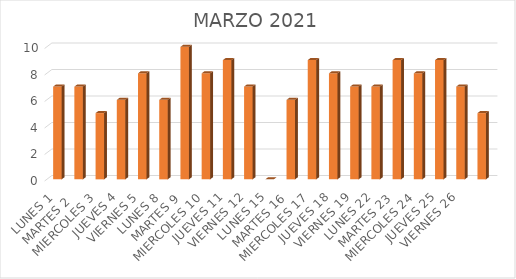
| Category | DIAS | PERSONAS ATENDIDAS | Series 1 |
|---|---|---|---|
| LUNES 1 |  |  | 7 |
| MARTES 2  |  |  | 7 |
| MIERCOLES 3 |  |  | 5 |
| JUEVES 4 |  |  | 6 |
| VIERNES 5 |  |  | 8 |
| LUNES 8 |  |  | 6 |
| MARTES 9 |  |  | 10 |
| MIERCOLES 10 |  |  | 8 |
| JUEVES 11 |  |  | 9 |
| VIERNES 12 |  |  | 7 |
| LUNES 15 |  |  | 0 |
| MARTES 16 |  |  | 6 |
| MIERCOLES 17 |  |  | 9 |
| JUEVES 18 |  |  | 8 |
| VIERNES 19 |  |  | 7 |
| LUNES 22 |  |  | 7 |
| MARTES 23 |  |  | 9 |
| MIERCOLES 24 |  |  | 8 |
| JUEVES 25 |  |  | 9 |
| VIERNES 26 |  |  | 7 |